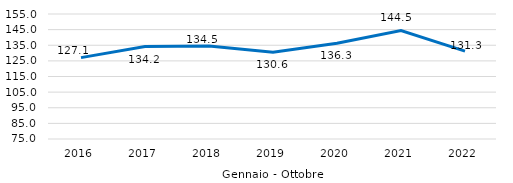
| Category | Series 0 |
|---|---|
| 0 | 127.082 |
| 1 | 134.166 |
| 2 | 134.523 |
| 3 | 130.562 |
| 4 | 136.273 |
| 5 | 144.457 |
| 6 | 131.266 |